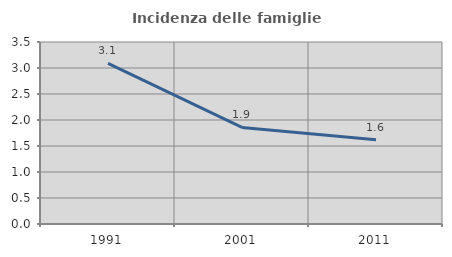
| Category | Incidenza delle famiglie numerose |
|---|---|
| 1991.0 | 3.089 |
| 2001.0 | 1.857 |
| 2011.0 | 1.619 |